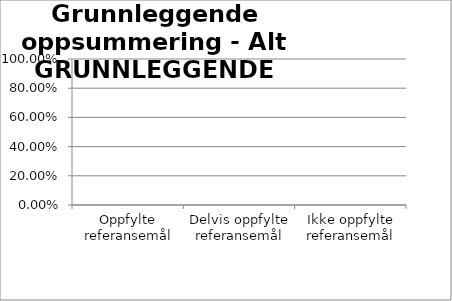
| Category | Basic Summary - All |
|---|---|
| Oppfylte referansemål | 0 |
| Delvis oppfylte referansemål | 0 |
| Ikke oppfylte referansemål | 0 |